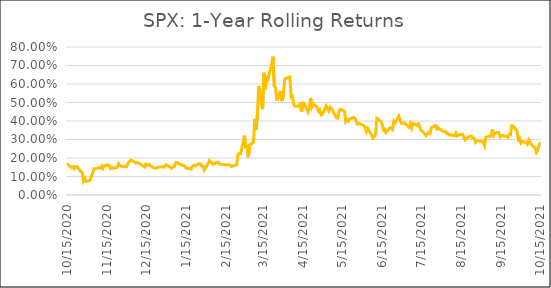
| Category | Series 0 |
|---|---|
| 10/15/20 | 0.163 |
| 10/16/20 | 0.165 |
| 10/19/20 | 0.148 |
| 10/20/20 | 0.153 |
| 10/21/20 | 0.143 |
| 10/22/20 | 0.153 |
| 10/23/20 | 0.153 |
| 10/26/20 | 0.125 |
| 10/27/20 | 0.122 |
| 10/28/20 | 0.076 |
| 10/29/20 | 0.09 |
| 10/30/20 | 0.073 |
| 11/2/20 | 0.079 |
| 11/3/20 | 0.099 |
| 11/4/20 | 0.119 |
| 11/5/20 | 0.142 |
| 11/6/20 | 0.141 |
| 11/9/20 | 0.148 |
| 11/10/20 | 0.146 |
| 11/11/20 | 0.157 |
| 11/12/20 | 0.144 |
| 11/13/20 | 0.159 |
| 11/16/20 | 0.162 |
| 11/17/20 | 0.157 |
| 11/18/20 | 0.143 |
| 11/19/20 | 0.148 |
| 11/20/20 | 0.144 |
| 11/23/20 | 0.15 |
| 11/24/20 | 0.169 |
| 11/25/20 | 0.158 |
| 11/27/20 | 0.154 |
| 11/30/20 | 0.153 |
| 12/1/20 | 0.166 |
| 12/2/20 | 0.178 |
| 12/3/20 | 0.185 |
| 12/4/20 | 0.188 |
| 12/7/20 | 0.174 |
| 12/8/20 | 0.177 |
| 12/9/20 | 0.171 |
| 12/10/20 | 0.171 |
| 12/11/20 | 0.166 |
| 12/14/20 | 0.151 |
| 12/15/20 | 0.166 |
| 12/16/20 | 0.16 |
| 12/17/20 | 0.166 |
| 12/18/20 | 0.162 |
| 12/21/20 | 0.147 |
| 12/22/20 | 0.145 |
| 12/23/20 | 0.145 |
| 12/24/20 | 0.149 |
| 12/28/20 | 0.153 |
| 12/29/20 | 0.15 |
| 12/30/20 | 0.159 |
| 12/31/20 | 0.163 |
| 1/4/21 | 0.144 |
| 1/5/21 | 0.152 |
| 1/6/21 | 0.155 |
| 1/7/21 | 0.175 |
| 1/8/21 | 0.176 |
| 1/11/21 | 0.164 |
| 1/12/21 | 0.164 |
| 1/13/21 | 0.159 |
| 1/14/21 | 0.156 |
| 1/15/21 | 0.146 |
| 1/19/21 | 0.141 |
| 1/20/21 | 0.157 |
| 1/21/21 | 0.16 |
| 1/22/21 | 0.156 |
| 1/25/21 | 0.17 |
| 1/26/21 | 0.168 |
| 1/27/21 | 0.156 |
| 1/28/21 | 0.156 |
| 1/29/21 | 0.135 |
| 2/1/21 | 0.17 |
| 2/2/21 | 0.186 |
| 2/3/21 | 0.179 |
| 2/4/21 | 0.174 |
| 2/5/21 | 0.166 |
| 2/8/21 | 0.177 |
| 2/9/21 | 0.175 |
| 2/10/21 | 0.166 |
| 2/11/21 | 0.166 |
| 2/12/21 | 0.164 |
| 2/16/21 | 0.163 |
| 2/17/21 | 0.163 |
| 2/18/21 | 0.161 |
| 2/19/21 | 0.154 |
| 2/22/21 | 0.161 |
| 2/23/21 | 0.163 |
| 2/24/21 | 0.217 |
| 2/25/21 | 0.224 |
| 2/26/21 | 0.223 |
| 3/1/21 | 0.321 |
| 3/2/21 | 0.252 |
| 3/3/21 | 0.272 |
| 3/4/21 | 0.204 |
| 3/5/21 | 0.271 |
| 3/8/21 | 0.286 |
| 3/9/21 | 0.411 |
| 3/10/21 | 0.353 |
| 3/11/21 | 0.437 |
| 3/12/21 | 0.59 |
| 3/15/21 | 0.464 |
| 3/16/21 | 0.661 |
| 3/17/21 | 0.571 |
| 3/18/21 | 0.633 |
| 3/19/21 | 0.624 |
| 3/22/21 | 0.71 |
| 3/23/21 | 0.748 |
| 3/24/21 | 0.589 |
| 3/25/21 | 0.579 |
| 3/26/21 | 0.511 |
| 3/29/21 | 0.563 |
| 3/30/21 | 0.507 |
| 3/31/21 | 0.537 |
| 4/1/21 | 0.627 |
| 4/5/21 | 0.639 |
| 4/6/21 | 0.529 |
| 4/7/21 | 0.534 |
| 4/8/21 | 0.49 |
| 4/9/21 | 0.48 |
| 4/12/21 | 0.48 |
| 4/13/21 | 0.5 |
| 4/14/21 | 0.449 |
| 4/15/21 | 0.498 |
| 4/16/21 | 0.495 |
| 4/19/21 | 0.448 |
| 4/20/21 | 0.465 |
| 4/21/21 | 0.525 |
| 4/22/21 | 0.477 |
| 4/23/21 | 0.494 |
| 4/26/21 | 0.476 |
| 4/27/21 | 0.454 |
| 4/28/21 | 0.461 |
| 4/29/21 | 0.433 |
| 4/30/21 | 0.436 |
| 5/3/21 | 0.481 |
| 5/4/21 | 0.465 |
| 5/5/21 | 0.453 |
| 5/6/21 | 0.475 |
| 5/7/21 | 0.469 |
| 5/10/21 | 0.43 |
| 5/11/21 | 0.417 |
| 5/12/21 | 0.416 |
| 5/13/21 | 0.458 |
| 5/14/21 | 0.463 |
| 5/17/21 | 0.454 |
| 5/18/21 | 0.397 |
| 5/19/21 | 0.408 |
| 5/20/21 | 0.4 |
| 5/21/21 | 0.409 |
| 5/24/21 | 0.42 |
| 5/25/21 | 0.417 |
| 5/26/21 | 0.403 |
| 5/27/21 | 0.384 |
| 5/28/21 | 0.388 |
| 6/1/21 | 0.375 |
| 6/2/21 | 0.366 |
| 6/3/21 | 0.343 |
| 6/4/21 | 0.359 |
| 6/7/21 | 0.323 |
| 6/8/21 | 0.308 |
| 6/9/21 | 0.316 |
| 6/10/21 | 0.329 |
| 6/11/21 | 0.415 |
| 6/14/21 | 0.399 |
| 6/15/21 | 0.385 |
| 6/16/21 | 0.352 |
| 6/17/21 | 0.356 |
| 6/18/21 | 0.337 |
| 6/21/21 | 0.364 |
| 6/22/21 | 0.362 |
| 6/23/21 | 0.355 |
| 6/24/21 | 0.399 |
| 6/25/21 | 0.388 |
| 6/28/21 | 0.426 |
| 6/29/21 | 0.406 |
| 6/30/21 | 0.386 |
| 7/1/21 | 0.386 |
| 7/2/21 | 0.391 |
| 7/6/21 | 0.366 |
| 7/7/21 | 0.386 |
| 7/8/21 | 0.363 |
| 7/9/21 | 0.386 |
| 7/12/21 | 0.377 |
| 7/13/21 | 0.385 |
| 7/14/21 | 0.368 |
| 7/15/21 | 0.351 |
| 7/16/21 | 0.346 |
| 7/19/21 | 0.321 |
| 7/20/21 | 0.329 |
| 7/21/21 | 0.338 |
| 7/22/21 | 0.333 |
| 7/23/21 | 0.363 |
| 7/26/21 | 0.375 |
| 7/27/21 | 0.359 |
| 7/28/21 | 0.367 |
| 7/29/21 | 0.356 |
| 7/30/21 | 0.354 |
| 8/2/21 | 0.341 |
| 8/3/21 | 0.343 |
| 8/4/21 | 0.332 |
| 8/5/21 | 0.331 |
| 8/6/21 | 0.325 |
| 8/9/21 | 0.323 |
| 8/10/21 | 0.32 |
| 8/11/21 | 0.334 |
| 8/12/21 | 0.32 |
| 8/13/21 | 0.324 |
| 8/16/21 | 0.328 |
| 8/17/21 | 0.315 |
| 8/18/21 | 0.298 |
| 8/19/21 | 0.305 |
| 8/20/21 | 0.312 |
| 8/23/21 | 0.319 |
| 8/24/21 | 0.307 |
| 8/25/21 | 0.306 |
| 8/26/21 | 0.285 |
| 8/27/21 | 0.294 |
| 8/30/21 | 0.291 |
| 8/31/21 | 0.292 |
| 9/1/21 | 0.283 |
| 9/2/21 | 0.267 |
| 9/3/21 | 0.313 |
| 9/7/21 | 0.319 |
| 9/8/21 | 0.355 |
| 9/9/21 | 0.322 |
| 9/10/21 | 0.335 |
| 9/13/21 | 0.338 |
| 9/14/21 | 0.313 |
| 9/15/21 | 0.317 |
| 9/16/21 | 0.321 |
| 9/17/21 | 0.321 |
| 9/20/21 | 0.313 |
| 9/21/21 | 0.327 |
| 9/22/21 | 0.326 |
| 9/23/21 | 0.374 |
| 9/24/21 | 0.372 |
| 9/27/21 | 0.347 |
| 9/28/21 | 0.299 |
| 9/29/21 | 0.307 |
| 9/30/21 | 0.281 |
| 10/1/21 | 0.289 |
| 10/4/21 | 0.284 |
| 10/5/21 | 0.275 |
| 10/6/21 | 0.298 |
| 10/7/21 | 0.287 |
| 10/8/21 | 0.274 |
| 10/11/21 | 0.254 |
| 10/12/21 | 0.231 |
| 10/13/21 | 0.243 |
| 10/14/21 | 0.272 |
| 10/15/21 | 0.284 |